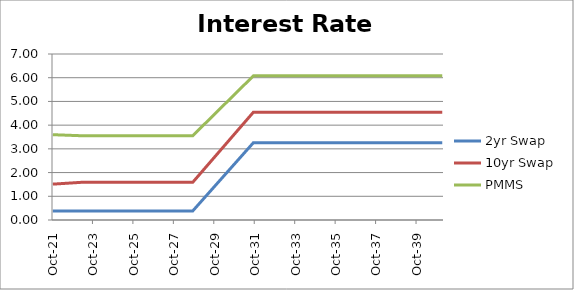
| Category | 2yr Swap | 10yr Swap | PMMS |
|---|---|---|---|
| 2021-10-31 | 0.381 | 1.512 | 3.597 |
| 2021-11-30 | 0.381 | 1.517 | 3.595 |
| 2021-12-31 | 0.381 | 1.521 | 3.592 |
| 2022-01-31 | 0.381 | 1.526 | 3.59 |
| 2022-02-28 | 0.381 | 1.53 | 3.587 |
| 2022-03-31 | 0.381 | 1.535 | 3.584 |
| 2022-04-30 | 0.381 | 1.539 | 3.582 |
| 2022-05-31 | 0.381 | 1.544 | 3.579 |
| 2022-06-30 | 0.381 | 1.548 | 3.576 |
| 2022-07-31 | 0.381 | 1.553 | 3.574 |
| 2022-08-31 | 0.381 | 1.557 | 3.571 |
| 2022-09-30 | 0.381 | 1.562 | 3.569 |
| 2022-10-31 | 0.381 | 1.566 | 3.566 |
| 2022-11-30 | 0.381 | 1.571 | 3.563 |
| 2022-12-31 | 0.381 | 1.575 | 3.561 |
| 2023-01-31 | 0.381 | 1.58 | 3.558 |
| 2023-02-28 | 0.381 | 1.584 | 3.556 |
| 2023-03-31 | 0.381 | 1.589 | 3.553 |
| 2023-04-30 | 0.381 | 1.589 | 3.553 |
| 2023-05-31 | 0.381 | 1.589 | 3.553 |
| 2023-06-30 | 0.381 | 1.589 | 3.553 |
| 2023-07-31 | 0.381 | 1.589 | 3.553 |
| 2023-08-31 | 0.381 | 1.589 | 3.553 |
| 2023-09-30 | 0.381 | 1.589 | 3.553 |
| 2023-10-31 | 0.381 | 1.589 | 3.553 |
| 2023-11-30 | 0.381 | 1.589 | 3.553 |
| 2023-12-31 | 0.381 | 1.589 | 3.553 |
| 2024-01-31 | 0.381 | 1.589 | 3.553 |
| 2024-02-29 | 0.381 | 1.589 | 3.553 |
| 2024-03-31 | 0.381 | 1.589 | 3.553 |
| 2024-04-30 | 0.381 | 1.589 | 3.553 |
| 2024-05-31 | 0.381 | 1.589 | 3.553 |
| 2024-06-30 | 0.381 | 1.589 | 3.553 |
| 2024-07-31 | 0.381 | 1.589 | 3.553 |
| 2024-08-31 | 0.381 | 1.589 | 3.553 |
| 2024-09-30 | 0.381 | 1.589 | 3.553 |
| 2024-10-31 | 0.381 | 1.589 | 3.553 |
| 2024-11-30 | 0.381 | 1.589 | 3.553 |
| 2024-12-31 | 0.381 | 1.589 | 3.553 |
| 2025-01-31 | 0.381 | 1.589 | 3.553 |
| 2025-02-28 | 0.381 | 1.589 | 3.553 |
| 2025-03-31 | 0.381 | 1.589 | 3.553 |
| 2025-04-30 | 0.381 | 1.589 | 3.553 |
| 2025-05-31 | 0.381 | 1.589 | 3.553 |
| 2025-06-30 | 0.381 | 1.589 | 3.553 |
| 2025-07-31 | 0.381 | 1.589 | 3.553 |
| 2025-08-31 | 0.381 | 1.589 | 3.553 |
| 2025-09-30 | 0.381 | 1.589 | 3.553 |
| 2025-10-31 | 0.381 | 1.589 | 3.553 |
| 2025-11-30 | 0.381 | 1.589 | 3.553 |
| 2025-12-31 | 0.381 | 1.589 | 3.553 |
| 2026-01-31 | 0.381 | 1.589 | 3.553 |
| 2026-02-28 | 0.381 | 1.589 | 3.553 |
| 2026-03-31 | 0.381 | 1.589 | 3.553 |
| 2026-04-30 | 0.381 | 1.589 | 3.553 |
| 2026-05-31 | 0.381 | 1.589 | 3.553 |
| 2026-06-30 | 0.381 | 1.589 | 3.553 |
| 2026-07-31 | 0.381 | 1.589 | 3.553 |
| 2026-08-31 | 0.381 | 1.589 | 3.553 |
| 2026-09-30 | 0.381 | 1.589 | 3.553 |
| 2026-10-31 | 0.381 | 1.589 | 3.553 |
| 2026-11-30 | 0.381 | 1.589 | 3.553 |
| 2026-12-31 | 0.381 | 1.589 | 3.553 |
| 2027-01-31 | 0.381 | 1.589 | 3.553 |
| 2027-02-28 | 0.381 | 1.589 | 3.553 |
| 2027-03-31 | 0.381 | 1.589 | 3.553 |
| 2027-04-30 | 0.381 | 1.589 | 3.553 |
| 2027-05-31 | 0.381 | 1.589 | 3.553 |
| 2027-06-30 | 0.381 | 1.589 | 3.553 |
| 2027-07-31 | 0.381 | 1.589 | 3.553 |
| 2027-08-31 | 0.381 | 1.589 | 3.553 |
| 2027-09-30 | 0.381 | 1.589 | 3.553 |
| 2027-10-31 | 0.381 | 1.589 | 3.553 |
| 2027-11-30 | 0.381 | 1.589 | 3.553 |
| 2027-12-31 | 0.381 | 1.589 | 3.553 |
| 2028-01-31 | 0.381 | 1.589 | 3.553 |
| 2028-02-29 | 0.381 | 1.589 | 3.553 |
| 2028-03-31 | 0.381 | 1.589 | 3.553 |
| 2028-04-30 | 0.381 | 1.589 | 3.553 |
| 2028-05-31 | 0.381 | 1.589 | 3.553 |
| 2028-06-30 | 0.381 | 1.589 | 3.553 |
| 2028-07-31 | 0.381 | 1.589 | 3.553 |
| 2028-08-31 | 0.381 | 1.589 | 3.553 |
| 2028-09-30 | 0.381 | 1.589 | 3.553 |
| 2028-10-31 | 0.461 | 1.671 | 3.623 |
| 2028-11-30 | 0.541 | 1.753 | 3.693 |
| 2028-12-31 | 0.621 | 1.835 | 3.763 |
| 2029-01-31 | 0.701 | 1.918 | 3.834 |
| 2029-02-28 | 0.781 | 2 | 3.904 |
| 2029-03-31 | 0.861 | 2.082 | 3.974 |
| 2029-04-30 | 0.941 | 2.164 | 4.044 |
| 2029-05-31 | 1.02 | 2.246 | 4.114 |
| 2029-06-30 | 1.1 | 2.328 | 4.185 |
| 2029-07-31 | 1.18 | 2.41 | 4.255 |
| 2029-08-31 | 1.26 | 2.493 | 4.325 |
| 2029-09-30 | 1.34 | 2.575 | 4.395 |
| 2029-10-31 | 1.42 | 2.657 | 4.465 |
| 2029-11-30 | 1.5 | 2.739 | 4.535 |
| 2029-12-31 | 1.58 | 2.821 | 4.606 |
| 2030-01-31 | 1.66 | 2.903 | 4.676 |
| 2030-02-28 | 1.74 | 2.985 | 4.746 |
| 2030-03-31 | 1.82 | 3.067 | 4.816 |
| 2030-04-30 | 1.9 | 3.15 | 4.886 |
| 2030-05-31 | 1.98 | 3.232 | 4.956 |
| 2030-06-30 | 2.06 | 3.314 | 5.027 |
| 2030-07-31 | 2.14 | 3.396 | 5.097 |
| 2030-08-31 | 2.22 | 3.478 | 5.167 |
| 2030-09-30 | 2.3 | 3.56 | 5.237 |
| 2030-10-31 | 2.38 | 3.642 | 5.307 |
| 2030-11-30 | 2.46 | 3.725 | 5.377 |
| 2030-12-31 | 2.54 | 3.807 | 5.448 |
| 2031-01-31 | 2.62 | 3.889 | 5.518 |
| 2031-02-28 | 2.7 | 3.971 | 5.588 |
| 2031-03-31 | 2.78 | 4.053 | 5.658 |
| 2031-04-30 | 2.86 | 4.135 | 5.728 |
| 2031-05-31 | 2.94 | 4.217 | 5.798 |
| 2031-06-30 | 3.019 | 4.3 | 5.869 |
| 2031-07-31 | 3.099 | 4.382 | 5.939 |
| 2031-08-31 | 3.179 | 4.464 | 6.009 |
| 2031-09-30 | 3.259 | 4.546 | 6.079 |
| 2031-10-31 | 3.259 | 4.546 | 6.079 |
| 2031-11-30 | 3.259 | 4.546 | 6.079 |
| 2031-12-31 | 3.259 | 4.546 | 6.079 |
| 2032-01-31 | 3.259 | 4.546 | 6.079 |
| 2032-02-29 | 3.259 | 4.546 | 6.079 |
| 2032-03-31 | 3.259 | 4.546 | 6.079 |
| 2032-04-30 | 3.259 | 4.546 | 6.079 |
| 2032-05-31 | 3.259 | 4.546 | 6.079 |
| 2032-06-30 | 3.259 | 4.546 | 6.079 |
| 2032-07-31 | 3.259 | 4.546 | 6.079 |
| 2032-08-31 | 3.259 | 4.546 | 6.079 |
| 2032-09-30 | 3.259 | 4.546 | 6.079 |
| 2032-10-31 | 3.259 | 4.546 | 6.079 |
| 2032-11-30 | 3.259 | 4.546 | 6.079 |
| 2032-12-31 | 3.259 | 4.546 | 6.079 |
| 2033-01-31 | 3.259 | 4.546 | 6.079 |
| 2033-02-28 | 3.259 | 4.546 | 6.079 |
| 2033-03-31 | 3.259 | 4.546 | 6.079 |
| 2033-04-30 | 3.259 | 4.546 | 6.079 |
| 2033-05-31 | 3.259 | 4.546 | 6.079 |
| 2033-06-30 | 3.259 | 4.546 | 6.079 |
| 2033-07-31 | 3.259 | 4.546 | 6.079 |
| 2033-08-31 | 3.259 | 4.546 | 6.079 |
| 2033-09-30 | 3.259 | 4.546 | 6.079 |
| 2033-10-31 | 3.259 | 4.546 | 6.079 |
| 2033-11-30 | 3.259 | 4.546 | 6.079 |
| 2033-12-31 | 3.259 | 4.546 | 6.079 |
| 2034-01-31 | 3.259 | 4.546 | 6.079 |
| 2034-02-28 | 3.259 | 4.546 | 6.079 |
| 2034-03-31 | 3.259 | 4.546 | 6.079 |
| 2034-04-30 | 3.259 | 4.546 | 6.079 |
| 2034-05-31 | 3.259 | 4.546 | 6.079 |
| 2034-06-30 | 3.259 | 4.546 | 6.079 |
| 2034-07-31 | 3.259 | 4.546 | 6.079 |
| 2034-08-31 | 3.259 | 4.546 | 6.079 |
| 2034-09-30 | 3.259 | 4.546 | 6.079 |
| 2034-10-31 | 3.259 | 4.546 | 6.079 |
| 2034-11-30 | 3.259 | 4.546 | 6.079 |
| 2034-12-31 | 3.259 | 4.546 | 6.079 |
| 2035-01-31 | 3.259 | 4.546 | 6.079 |
| 2035-02-28 | 3.259 | 4.546 | 6.079 |
| 2035-03-31 | 3.259 | 4.546 | 6.079 |
| 2035-04-30 | 3.259 | 4.546 | 6.079 |
| 2035-05-31 | 3.259 | 4.546 | 6.079 |
| 2035-06-30 | 3.259 | 4.546 | 6.079 |
| 2035-07-31 | 3.259 | 4.546 | 6.079 |
| 2035-08-31 | 3.259 | 4.546 | 6.079 |
| 2035-09-30 | 3.259 | 4.546 | 6.079 |
| 2035-10-31 | 3.259 | 4.546 | 6.079 |
| 2035-11-30 | 3.259 | 4.546 | 6.079 |
| 2035-12-31 | 3.259 | 4.546 | 6.079 |
| 2036-01-31 | 3.259 | 4.546 | 6.079 |
| 2036-02-29 | 3.259 | 4.546 | 6.079 |
| 2036-03-31 | 3.259 | 4.546 | 6.079 |
| 2036-04-30 | 3.259 | 4.546 | 6.079 |
| 2036-05-31 | 3.259 | 4.546 | 6.079 |
| 2036-06-30 | 3.259 | 4.546 | 6.079 |
| 2036-07-31 | 3.259 | 4.546 | 6.079 |
| 2036-08-31 | 3.259 | 4.546 | 6.079 |
| 2036-09-30 | 3.259 | 4.546 | 6.079 |
| 2036-10-31 | 3.259 | 4.546 | 6.079 |
| 2036-11-30 | 3.259 | 4.546 | 6.079 |
| 2036-12-31 | 3.259 | 4.546 | 6.079 |
| 2037-01-31 | 3.259 | 4.546 | 6.079 |
| 2037-02-28 | 3.259 | 4.546 | 6.079 |
| 2037-03-31 | 3.259 | 4.546 | 6.079 |
| 2037-04-30 | 3.259 | 4.546 | 6.079 |
| 2037-05-31 | 3.259 | 4.546 | 6.079 |
| 2037-06-30 | 3.259 | 4.546 | 6.079 |
| 2037-07-31 | 3.259 | 4.546 | 6.079 |
| 2037-08-31 | 3.259 | 4.546 | 6.079 |
| 2037-09-30 | 3.259 | 4.546 | 6.079 |
| 2037-10-31 | 3.259 | 4.546 | 6.079 |
| 2037-11-30 | 3.259 | 4.546 | 6.079 |
| 2037-12-31 | 3.259 | 4.546 | 6.079 |
| 2038-01-31 | 3.259 | 4.546 | 6.079 |
| 2038-02-28 | 3.259 | 4.546 | 6.079 |
| 2038-03-31 | 3.259 | 4.546 | 6.079 |
| 2038-04-30 | 3.259 | 4.546 | 6.079 |
| 2038-05-31 | 3.259 | 4.546 | 6.079 |
| 2038-06-30 | 3.259 | 4.546 | 6.079 |
| 2038-07-31 | 3.259 | 4.546 | 6.079 |
| 2038-08-31 | 3.259 | 4.546 | 6.079 |
| 2038-09-30 | 3.259 | 4.546 | 6.079 |
| 2038-10-31 | 3.259 | 4.546 | 6.079 |
| 2038-11-30 | 3.259 | 4.546 | 6.079 |
| 2038-12-31 | 3.259 | 4.546 | 6.079 |
| 2039-01-31 | 3.259 | 4.546 | 6.079 |
| 2039-02-28 | 3.259 | 4.546 | 6.079 |
| 2039-03-31 | 3.259 | 4.546 | 6.079 |
| 2039-04-30 | 3.259 | 4.546 | 6.079 |
| 2039-05-31 | 3.259 | 4.546 | 6.079 |
| 2039-06-30 | 3.259 | 4.546 | 6.079 |
| 2039-07-31 | 3.259 | 4.546 | 6.079 |
| 2039-08-31 | 3.259 | 4.546 | 6.079 |
| 2039-09-30 | 3.259 | 4.546 | 6.079 |
| 2039-10-31 | 3.259 | 4.546 | 6.079 |
| 2039-11-30 | 3.259 | 4.546 | 6.079 |
| 2039-12-31 | 3.259 | 4.546 | 6.079 |
| 2040-01-31 | 3.259 | 4.546 | 6.079 |
| 2040-02-29 | 3.259 | 4.546 | 6.079 |
| 2040-03-31 | 3.259 | 4.546 | 6.079 |
| 2040-04-30 | 3.259 | 4.546 | 6.079 |
| 2040-05-31 | 3.259 | 4.546 | 6.079 |
| 2040-06-30 | 3.259 | 4.546 | 6.079 |
| 2040-07-31 | 3.259 | 4.546 | 6.079 |
| 2040-08-31 | 3.259 | 4.546 | 6.079 |
| 2040-09-30 | 3.259 | 4.546 | 6.079 |
| 2040-10-31 | 3.259 | 4.546 | 6.079 |
| 2040-11-30 | 3.259 | 4.546 | 6.079 |
| 2040-12-31 | 3.259 | 4.546 | 6.079 |
| 2041-01-31 | 3.259 | 4.546 | 6.079 |